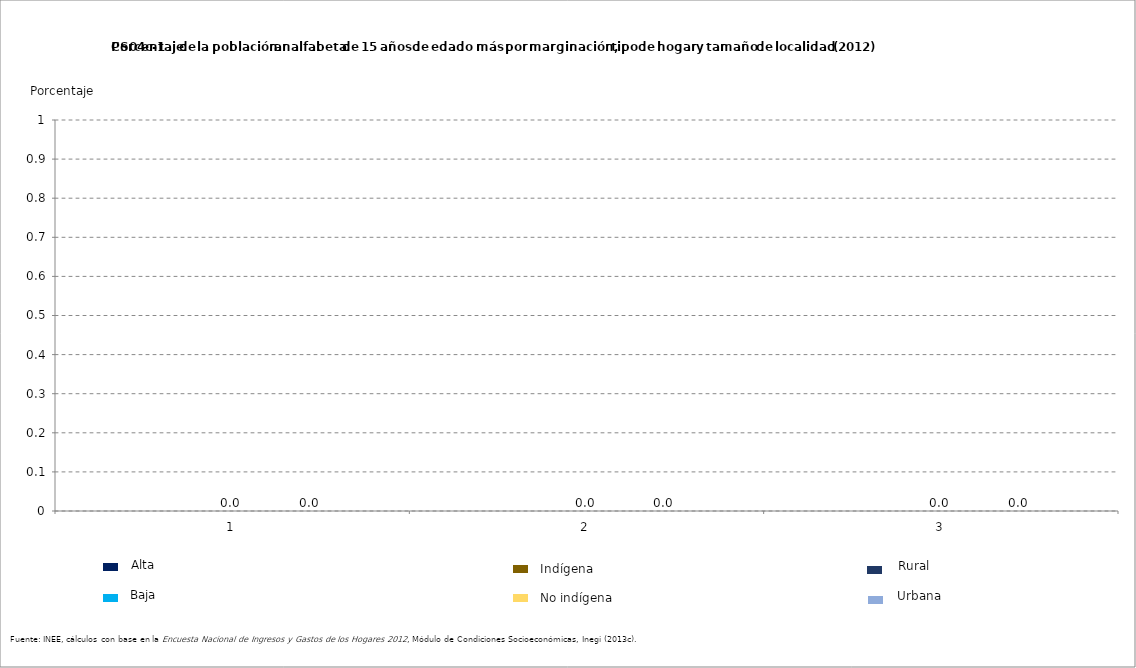
| Category | Series 0 | Series 1 | Series 2 |
|---|---|---|---|
| 0 |  | 20.972 | 5.323 |
| 1 |  | 19.548 | 5.411 |
| 2 |  | 14.887 | 3.356 |